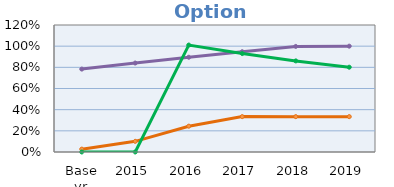
| Category | Coverage of households with improved sanitation facility in city | Septic tanks cleaned annually in city  | Adequacy of septage treatment capacity |
|---|---|---|---|
| Base yr | 0.783 | 0.027 | 0 |
| 2015 | 0.841 | 0.101 | 0 |
| 2016 | 0.895 | 0.244 | 1.011 |
| 2017 | 0.948 | 0.334 | 0.93 |
| 2018 | 0.998 | 0.334 | 0.861 |
| 2019 | 1 | 0.334 | 0.801 |